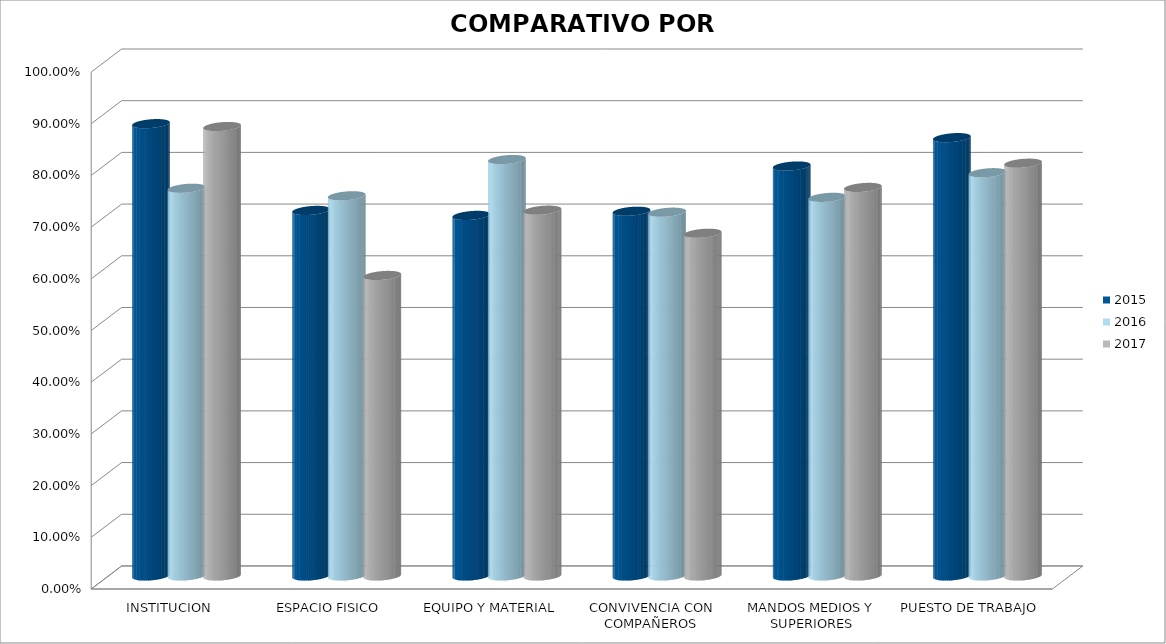
| Category | 2015 | 2016 | 2017 |
|---|---|---|---|
| INSTITUCION | 0.875 | 0.75 | 0.869 |
| ESPACIO FISICO | 0.707 | 0.735 | 0.581 |
| EQUIPO Y MATERIAL | 0.698 | 0.806 | 0.708 |
| CONVIVENCIA CON COMPAÑEROS | 0.706 | 0.704 | 0.663 |
| MANDOS MEDIOS Y SUPERIORES | 0.793 | 0.732 | 0.752 |
| PUESTO DE TRABAJO | 0.848 | 0.78 | 0.798 |